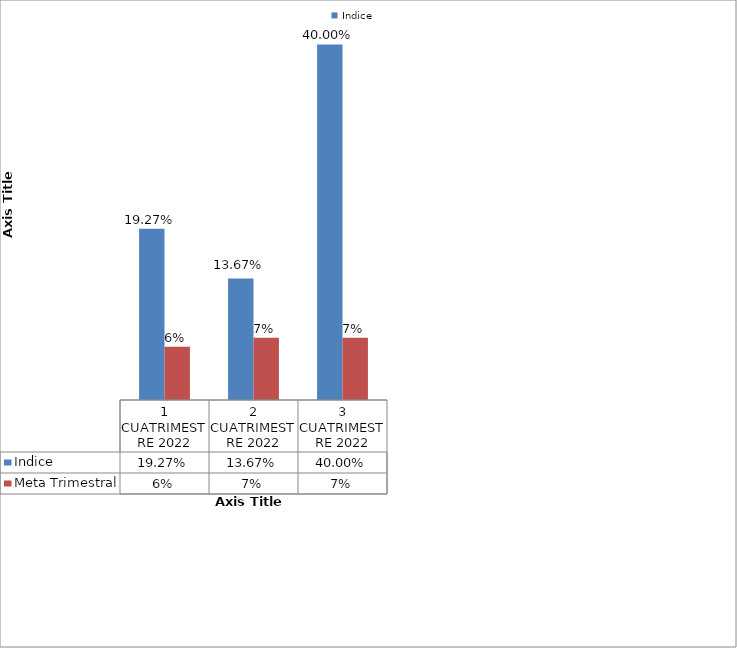
| Category | Indice | Meta Trimestral |
|---|---|---|
| 1 CUATRIMESTRE 2022 | 0.193 | 0.06 |
| 2 CUATRIMESTRE 2022 | 0.137 | 0.07 |
| 3 CUATRIMESTRE 2022 | 0.4 | 0.07 |